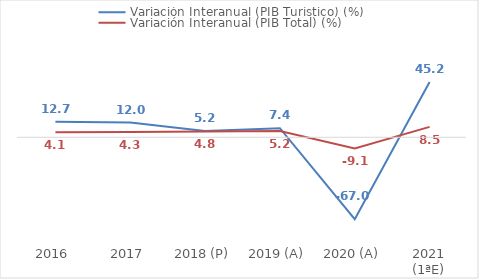
| Category | Variación Interanual (PIB Turístico) (%) | Variación Interanual (PIB Total) (%) |
|---|---|---|
| 2016 | 12.698 | 4.142 |
| 2017 | 12.018 | 4.289 |
| 2018 (P) | 5.165 | 4.812 |
| 2019 (A) | 7.416 | 5.165 |
| 2020 (A) | -67.018 | -9.141 |
| 2021 (1ªE) | 45.235 | 8.526 |